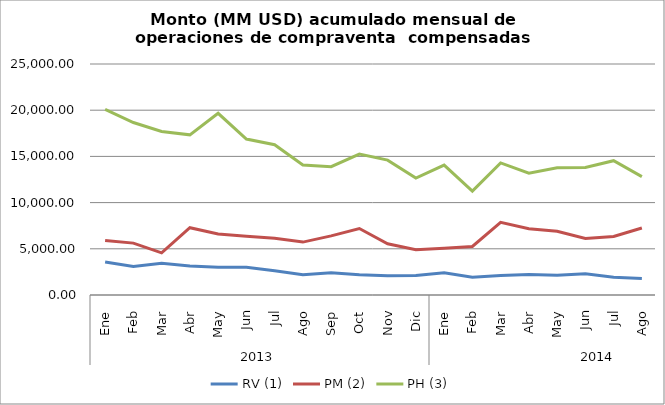
| Category | RV (1) | PM (2) | PH (3) |
|---|---|---|---|
| 0 | 3582.113 | 5901.651 | 20087.034 |
| 1 | 3086.223 | 5614.086 | 18662.914 |
| 2 | 3427.503 | 4559.027 | 17696.541 |
| 3 | 3146.302 | 7279.906 | 17332.385 |
| 4 | 2992.826 | 6596.857 | 19663.42 |
| 5 | 3012.804 | 6346.526 | 16878.408 |
| 6 | 2618.878 | 6139.885 | 16263.385 |
| 7 | 2182.732 | 5724.829 | 14069.305 |
| 8 | 2409.674 | 6399.577 | 13889.23 |
| 9 | 2180.079 | 7195.606 | 15254.774 |
| 10 | 2095.442 | 5541.836 | 14598.61 |
| 11 | 2104.88 | 4905.995 | 12657.524 |
| 12 | 2410.581 | 5047.1 | 14052.921 |
| 13 | 1913.3 | 5251.955 | 11240.27 |
| 14 | 2111.981 | 7861.413 | 14290.324 |
| 15 | 2223.473 | 7175.644 | 13176.799 |
| 16 | 2125.013 | 6892.343 | 13776.518 |
| 17 | 2301.328 | 6106.398 | 13805.87 |
| 18 | 1924.188 | 6332.088 | 14535.523 |
| 19 | 1793.449 | 7254.313 | 12809.829 |